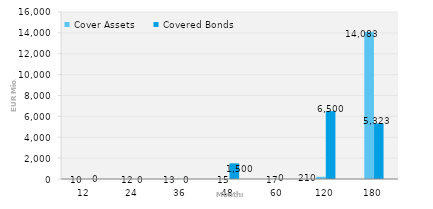
| Category | Cover Assets | Covered Bonds |
|---|---|---|
| 12.0 | 10.124 | 0 |
| 24.0 | 11.647 | 0 |
| 36.0 | 13.307 | 0 |
| 48.0 | 15.184 | 1500 |
| 60.0 | 17.35 | 0 |
| 120.0 | 209.678 | 6500 |
| 180.0 | 14082.71 | 5323 |